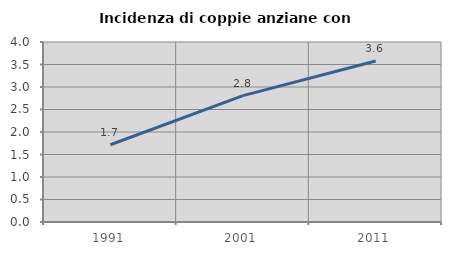
| Category | Incidenza di coppie anziane con figli |
|---|---|
| 1991.0 | 1.716 |
| 2001.0 | 2.809 |
| 2011.0 | 3.576 |